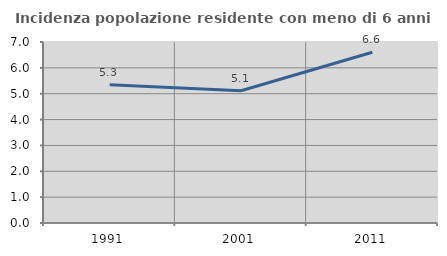
| Category | Incidenza popolazione residente con meno di 6 anni |
|---|---|
| 1991.0 | 5.345 |
| 2001.0 | 5.117 |
| 2011.0 | 6.605 |